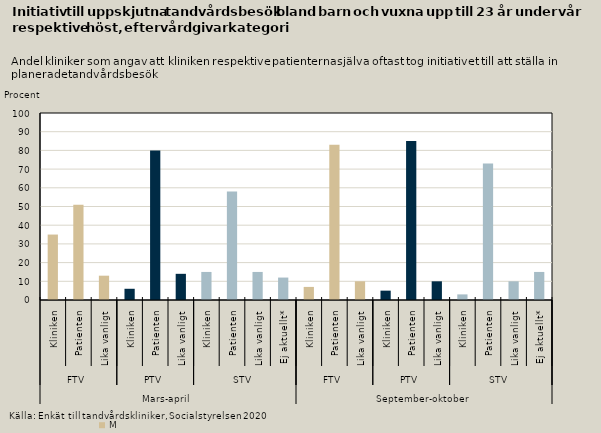
| Category | Barn och vuxna uppt ill 23 år |
|---|---|
| 0 | 35 |
| 1 | 51 |
| 2 | 13 |
| 3 | 6 |
| 4 | 80 |
| 5 | 14 |
| 6 | 15 |
| 7 | 58 |
| 8 | 15 |
| 9 | 12 |
| 10 | 7 |
| 11 | 83 |
| 12 | 10 |
| 13 | 5 |
| 14 | 85 |
| 15 | 10 |
| 16 | 3 |
| 17 | 73 |
| 18 | 10 |
| 19 | 15 |